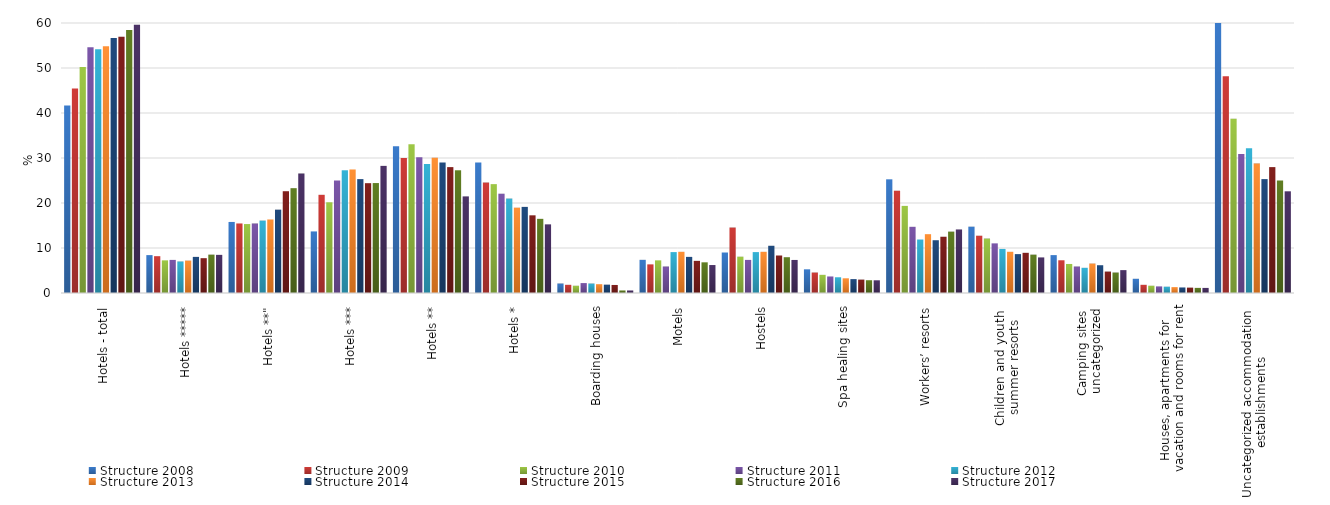
| Category | Structure 2008 | Structure 2009 | Structure 2010 | Structure 2011 | Structure 2012 | Structure 2013 | Structure 2014 | Structure 2015 | Structure 2016 | Structure 2017 |
|---|---|---|---|---|---|---|---|---|---|---|
| Hotels - total | 41.667 | 45.455 | 50.202 | 54.618 | 54.167 | 54.839 | 56.643 | 56.949 | 58.472 | 59.596 |
| Hotels ***** | 8.421 | 8.182 | 7.258 | 7.353 | 6.993 | 7.19 | 8.025 | 7.738 | 8.523 | 8.475 |
| Hotels **" | 15.789 | 15.455 | 15.323 | 15.441 | 16.084 | 16.34 | 18.519 | 22.619 | 23.295 | 26.554 |
| Hotels *** | 13.684 | 21.818 | 20.161 | 25 | 27.273 | 27.451 | 25.309 | 24.405 | 24.432 | 28.249 |
| Hotels ** | 32.632 | 30 | 33.065 | 30.147 | 28.671 | 30.065 | 29.012 | 27.976 | 27.273 | 21.469 |
| Hotels * | 29 | 24.545 | 24.194 | 22.059 | 20.979 | 18.954 | 19.136 | 17.262 | 16.477 | 15.254 |
| Boarding houses | 2.105 | 1.818 | 1.613 | 2.206 | 2.098 | 1.961 | 1.852 | 1.786 | 0.568 | 0.565 |
| Motels | 7.368 | 6.364 | 7.258 | 5.882 | 9.091 | 9.15 | 8.025 | 7.143 | 6.818 | 6.215 |
| Hostels | 9 | 14.545 | 8.065 | 7.353 | 9.091 | 9.15 | 10.494 | 8.333 | 7.955 | 7.345 |
| Spa healing sites | 5.263 | 4.545 | 4.032 | 3.676 | 3.497 | 3.268 | 3.086 | 2.976 | 2.841 | 2.825 |
| Workers’ resorts | 25.263 | 22.727 | 19.355 | 14.706 | 11.888 | 13.072 | 11.728 | 12.5 | 13.636 | 14.124 |
| Children and youth 
summer resorts | 14.737 | 12.727 | 12.097 | 11.029 | 9.79 | 9.15 | 8.642 | 8.929 | 8.523 | 7.91 |
| Camping sites 
uncategorized | 8.421 | 7.273 | 6.452 | 5.882 | 5.594 | 6.536 | 6.173 | 4.762 | 4.545 | 5.085 |
| Houses, apartments for 
vacation and rooms for rent | 3.158 | 1.818 | 1.613 | 1.471 | 1.399 | 1.307 | 1.235 | 1.19 | 1.136 | 1.13 |
| Uncategorized accommodation 
establishments | 63.158 | 48.182 | 38.71 | 30.882 | 32.168 | 28.758 | 25.309 | 27.976 | 25 | 22.599 |